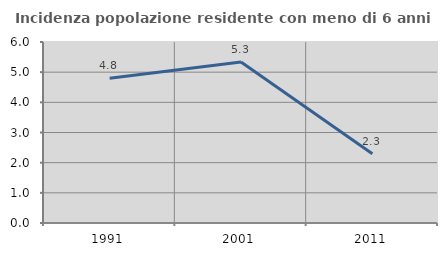
| Category | Incidenza popolazione residente con meno di 6 anni |
|---|---|
| 1991.0 | 4.795 |
| 2001.0 | 5.337 |
| 2011.0 | 2.297 |